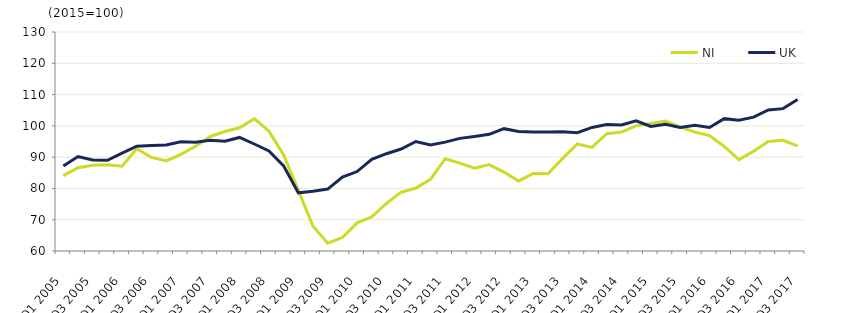
| Category | NI  | UK  |
|---|---|---|
| Q1 2005 | 84.1 | 87.2 |
|  | 86.6 | 90.2 |
| Q3 2005 | 87.4 | 89.1 |
|  | 87.6 | 89 |
| Q1 2006 | 87.1 | 91.3 |
|  | 92.7 | 93.5 |
| Q3 2006 | 89.9 | 93.7 |
|  | 88.8 | 93.9 |
| Q1 2007 | 90.9 | 94.9 |
|  | 93.5 | 94.8 |
| Q3 2007 | 96.6 | 95.4 |
|  | 98.2 | 95.1 |
| Q1 2008 | 99.4 | 96.3 |
|  | 102.3 | 94.2 |
| Q3 2008 | 98.3 | 92 |
|  | 90.7 | 87.2 |
| Q1 2009 | 79.4 | 78.6 |
|  | 67.9 | 79.1 |
| Q3 2009 | 62.5 | 79.8 |
|  | 64.3 | 83.6 |
| Q1 2010 | 69 | 85.4 |
|  | 70.9 | 89.3 |
| Q3 2010 | 75.2 | 91.1 |
|  | 78.8 | 92.6 |
| Q1 2011 | 80.1 | 95 |
|  | 82.9 | 93.9 |
| Q3 2011 | 89.5 | 94.8 |
|  | 88.1 | 96 |
| Q1 2012 | 86.5 | 96.6 |
|  | 87.6 | 97.3 |
| Q3 2012 | 85.2 | 99.1 |
|  | 82.4 | 98.2 |
| Q1 2013 | 84.8 | 98 |
|  | 84.7 | 98 |
| Q3 2013 | 89.6 | 98.1 |
|  | 94.2 | 97.8 |
| Q1 2014 | 93.1 | 99.5 |
|  | 97.5 | 100.4 |
| Q3 2014 | 98 | 100.3 |
|  | 100 | 101.6 |
| Q1 2015 | 100.8 | 99.8 |
|  | 101.5 | 100.5 |
| Q3 2015 | 99.7 | 99.5 |
|  | 98 | 100.2 |
| Q1 2016 | 96.9 | 99.5 |
|  | 93.4 | 102.3 |
| Q3 2016 | 89.2 | 101.8 |
|  | 91.9 | 102.8 |
| Q1 2017 | 95 | 105.1 |
|  | 95.4 | 105.5 |
| Q3 2017 | 93.6 | 108.4 |